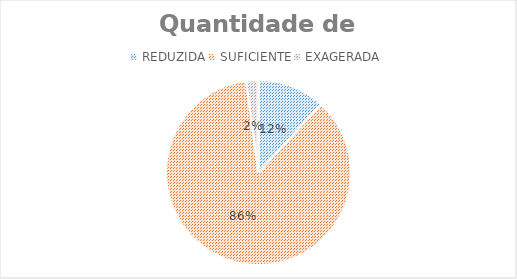
| Category | Alunos |
|---|---|
| REDUZIDA | 11 |
| SUFICIENTE | 80 |
| EXAGERADA | 2 |